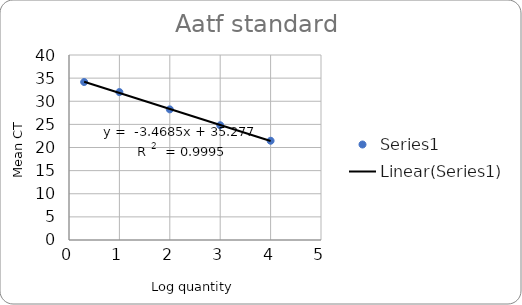
| Category | Series 0 |
|---|---|
| 4.0 | 21.456 |
| 3.0 | 24.814 |
| 2.0 | 28.244 |
| 1.0 | 31.984 |
| 0.3010299956639812 | 34.158 |